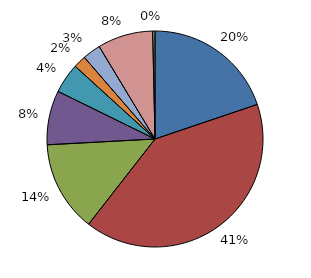
| Category | N |
|---|---|
| Eau | 1797 |
| Aménagement de Zones, Lotissement, Ateliers | 3693 |
| Économie | 1234 |
| Tourisme-Culture-Sport | 736 |
| Santé-Social | 408 |
| Scolaire | 171 |
| Transport | 246 |
| Ordures | 753 |
| Administration | 31 |